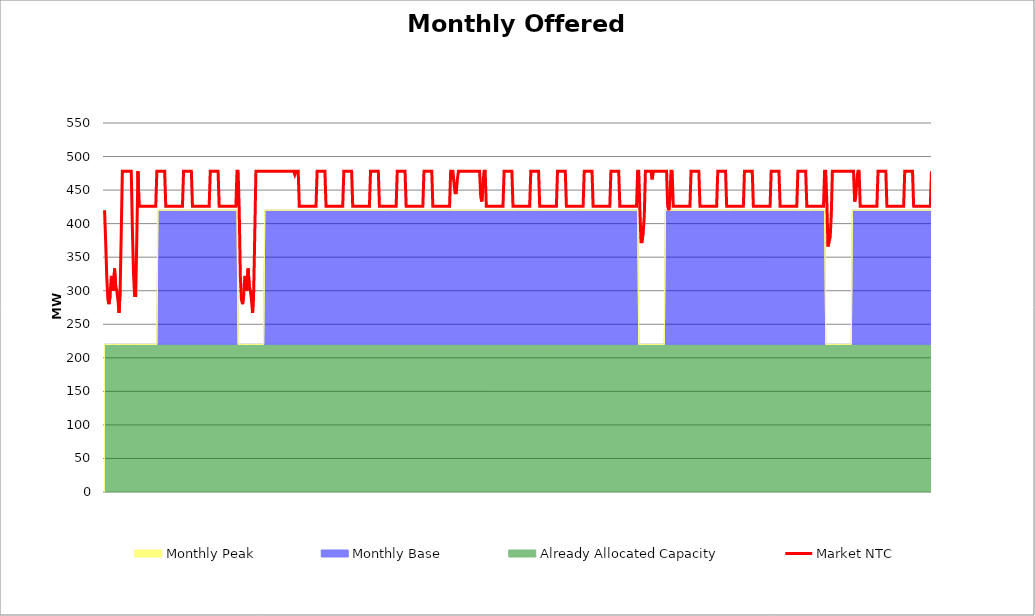
| Category | Market NTC |
|---|---|
| 0 | 420 |
| 1 | 373 |
| 2 | 320 |
| 3 | 287 |
| 4 | 280 |
| 5 | 293 |
| 6 | 320 |
| 7 | 320 |
| 8 | 300 |
| 9 | 333 |
| 10 | 307 |
| 11 | 300 |
| 12 | 287 |
| 13 | 267 |
| 14 | 300 |
| 15 | 386 |
| 16 | 478 |
| 17 | 478 |
| 18 | 478 |
| 19 | 478 |
| 20 | 478 |
| 21 | 478 |
| 22 | 478 |
| 23 | 478 |
| 24 | 478 |
| 25 | 393 |
| 26 | 326 |
| 27 | 293 |
| 28 | 293 |
| 29 | 380 |
| 30 | 478 |
| 31 | 426 |
| 32 | 426 |
| 33 | 426 |
| 34 | 426 |
| 35 | 426 |
| 36 | 426 |
| 37 | 426 |
| 38 | 426 |
| 39 | 426 |
| 40 | 426 |
| 41 | 426 |
| 42 | 426 |
| 43 | 426 |
| 44 | 426 |
| 45 | 426 |
| 46 | 426 |
| 47 | 478 |
| 48 | 478 |
| 49 | 478 |
| 50 | 478 |
| 51 | 478 |
| 52 | 478 |
| 53 | 478 |
| 54 | 478 |
| 55 | 426 |
| 56 | 426 |
| 57 | 426 |
| 58 | 426 |
| 59 | 426 |
| 60 | 426 |
| 61 | 426 |
| 62 | 426 |
| 63 | 426 |
| 64 | 426 |
| 65 | 426 |
| 66 | 426 |
| 67 | 426 |
| 68 | 426 |
| 69 | 426 |
| 70 | 426 |
| 71 | 478 |
| 72 | 478 |
| 73 | 478 |
| 74 | 478 |
| 75 | 478 |
| 76 | 478 |
| 77 | 478 |
| 78 | 478 |
| 79 | 426 |
| 80 | 426 |
| 81 | 426 |
| 82 | 426 |
| 83 | 426 |
| 84 | 426 |
| 85 | 426 |
| 86 | 426 |
| 87 | 426 |
| 88 | 426 |
| 89 | 426 |
| 90 | 426 |
| 91 | 426 |
| 92 | 426 |
| 93 | 426 |
| 94 | 426 |
| 95 | 478 |
| 96 | 478 |
| 97 | 478 |
| 98 | 478 |
| 99 | 478 |
| 100 | 478 |
| 101 | 478 |
| 102 | 478 |
| 103 | 426 |
| 104 | 426 |
| 105 | 426 |
| 106 | 426 |
| 107 | 426 |
| 108 | 426 |
| 109 | 426 |
| 110 | 426 |
| 111 | 426 |
| 112 | 426 |
| 113 | 426 |
| 114 | 426 |
| 115 | 426 |
| 116 | 426 |
| 117 | 426 |
| 118 | 426 |
| 119 | 478 |
| 120 | 478 |
| 121 | 421 |
| 122 | 321 |
| 123 | 287 |
| 124 | 280 |
| 125 | 293 |
| 126 | 320 |
| 127 | 320 |
| 128 | 300 |
| 129 | 333 |
| 130 | 307 |
| 131 | 300 |
| 132 | 287 |
| 133 | 267 |
| 134 | 300 |
| 135 | 386 |
| 136 | 478 |
| 137 | 478 |
| 138 | 478 |
| 139 | 478 |
| 140 | 478 |
| 141 | 478 |
| 142 | 478 |
| 143 | 478 |
| 144 | 478 |
| 145 | 478 |
| 146 | 478 |
| 147 | 478 |
| 148 | 478 |
| 149 | 478 |
| 150 | 478 |
| 151 | 478 |
| 152 | 478 |
| 153 | 478 |
| 154 | 478 |
| 155 | 478 |
| 156 | 478 |
| 157 | 478 |
| 158 | 478 |
| 159 | 478 |
| 160 | 478 |
| 161 | 478 |
| 162 | 478 |
| 163 | 478 |
| 164 | 478 |
| 165 | 478 |
| 166 | 478 |
| 167 | 478 |
| 168 | 478 |
| 169 | 478 |
| 170 | 478 |
| 171 | 473 |
| 172 | 478 |
| 173 | 478 |
| 174 | 478 |
| 175 | 426 |
| 176 | 426 |
| 177 | 426 |
| 178 | 426 |
| 179 | 426 |
| 180 | 426 |
| 181 | 426 |
| 182 | 426 |
| 183 | 426 |
| 184 | 426 |
| 185 | 426 |
| 186 | 426 |
| 187 | 426 |
| 188 | 426 |
| 189 | 426 |
| 190 | 426 |
| 191 | 478 |
| 192 | 478 |
| 193 | 478 |
| 194 | 478 |
| 195 | 478 |
| 196 | 478 |
| 197 | 478 |
| 198 | 478 |
| 199 | 426 |
| 200 | 426 |
| 201 | 426 |
| 202 | 426 |
| 203 | 426 |
| 204 | 426 |
| 205 | 426 |
| 206 | 426 |
| 207 | 426 |
| 208 | 426 |
| 209 | 426 |
| 210 | 426 |
| 211 | 426 |
| 212 | 426 |
| 213 | 426 |
| 214 | 426 |
| 215 | 478 |
| 216 | 478 |
| 217 | 478 |
| 218 | 478 |
| 219 | 478 |
| 220 | 478 |
| 221 | 478 |
| 222 | 478 |
| 223 | 426 |
| 224 | 426 |
| 225 | 426 |
| 226 | 426 |
| 227 | 426 |
| 228 | 426 |
| 229 | 426 |
| 230 | 426 |
| 231 | 426 |
| 232 | 426 |
| 233 | 426 |
| 234 | 426 |
| 235 | 426 |
| 236 | 426 |
| 237 | 426 |
| 238 | 426 |
| 239 | 478 |
| 240 | 478 |
| 241 | 478 |
| 242 | 478 |
| 243 | 478 |
| 244 | 478 |
| 245 | 478 |
| 246 | 478 |
| 247 | 426 |
| 248 | 426 |
| 249 | 426 |
| 250 | 426 |
| 251 | 426 |
| 252 | 426 |
| 253 | 426 |
| 254 | 426 |
| 255 | 426 |
| 256 | 426 |
| 257 | 426 |
| 258 | 426 |
| 259 | 426 |
| 260 | 426 |
| 261 | 426 |
| 262 | 426 |
| 263 | 478 |
| 264 | 478 |
| 265 | 478 |
| 266 | 478 |
| 267 | 478 |
| 268 | 478 |
| 269 | 478 |
| 270 | 478 |
| 271 | 426 |
| 272 | 426 |
| 273 | 426 |
| 274 | 426 |
| 275 | 426 |
| 276 | 426 |
| 277 | 426 |
| 278 | 426 |
| 279 | 426 |
| 280 | 426 |
| 281 | 426 |
| 282 | 426 |
| 283 | 426 |
| 284 | 426 |
| 285 | 426 |
| 286 | 426 |
| 287 | 478 |
| 288 | 478 |
| 289 | 478 |
| 290 | 478 |
| 291 | 478 |
| 292 | 478 |
| 293 | 478 |
| 294 | 478 |
| 295 | 426 |
| 296 | 426 |
| 297 | 426 |
| 298 | 426 |
| 299 | 426 |
| 300 | 426 |
| 301 | 426 |
| 302 | 426 |
| 303 | 426 |
| 304 | 426 |
| 305 | 426 |
| 306 | 426 |
| 307 | 426 |
| 308 | 426 |
| 309 | 426 |
| 310 | 426 |
| 311 | 478 |
| 312 | 478 |
| 313 | 478 |
| 314 | 460 |
| 315 | 446 |
| 316 | 446 |
| 317 | 466 |
| 318 | 478 |
| 319 | 478 |
| 320 | 478 |
| 321 | 478 |
| 322 | 478 |
| 323 | 478 |
| 324 | 478 |
| 325 | 478 |
| 326 | 478 |
| 327 | 478 |
| 328 | 478 |
| 329 | 478 |
| 330 | 478 |
| 331 | 478 |
| 332 | 478 |
| 333 | 478 |
| 334 | 478 |
| 335 | 478 |
| 336 | 478 |
| 337 | 478 |
| 338 | 440 |
| 339 | 433 |
| 340 | 460 |
| 341 | 478 |
| 342 | 478 |
| 343 | 426 |
| 344 | 426 |
| 345 | 426 |
| 346 | 426 |
| 347 | 426 |
| 348 | 426 |
| 349 | 426 |
| 350 | 426 |
| 351 | 426 |
| 352 | 426 |
| 353 | 426 |
| 354 | 426 |
| 355 | 426 |
| 356 | 426 |
| 357 | 426 |
| 358 | 426 |
| 359 | 478 |
| 360 | 478 |
| 361 | 478 |
| 362 | 478 |
| 363 | 478 |
| 364 | 478 |
| 365 | 478 |
| 366 | 478 |
| 367 | 426 |
| 368 | 426 |
| 369 | 426 |
| 370 | 426 |
| 371 | 426 |
| 372 | 426 |
| 373 | 426 |
| 374 | 426 |
| 375 | 426 |
| 376 | 426 |
| 377 | 426 |
| 378 | 426 |
| 379 | 426 |
| 380 | 426 |
| 381 | 426 |
| 382 | 426 |
| 383 | 478 |
| 384 | 478 |
| 385 | 478 |
| 386 | 478 |
| 387 | 478 |
| 388 | 478 |
| 389 | 478 |
| 390 | 478 |
| 391 | 426 |
| 392 | 426 |
| 393 | 426 |
| 394 | 426 |
| 395 | 426 |
| 396 | 426 |
| 397 | 426 |
| 398 | 426 |
| 399 | 426 |
| 400 | 426 |
| 401 | 426 |
| 402 | 426 |
| 403 | 426 |
| 404 | 426 |
| 405 | 426 |
| 406 | 426 |
| 407 | 478 |
| 408 | 478 |
| 409 | 478 |
| 410 | 478 |
| 411 | 478 |
| 412 | 478 |
| 413 | 478 |
| 414 | 478 |
| 415 | 426 |
| 416 | 426 |
| 417 | 426 |
| 418 | 426 |
| 419 | 426 |
| 420 | 426 |
| 421 | 426 |
| 422 | 426 |
| 423 | 426 |
| 424 | 426 |
| 425 | 426 |
| 426 | 426 |
| 427 | 426 |
| 428 | 426 |
| 429 | 426 |
| 430 | 426 |
| 431 | 478 |
| 432 | 478 |
| 433 | 478 |
| 434 | 478 |
| 435 | 478 |
| 436 | 478 |
| 437 | 478 |
| 438 | 478 |
| 439 | 426 |
| 440 | 426 |
| 441 | 426 |
| 442 | 426 |
| 443 | 426 |
| 444 | 426 |
| 445 | 426 |
| 446 | 426 |
| 447 | 426 |
| 448 | 426 |
| 449 | 426 |
| 450 | 426 |
| 451 | 426 |
| 452 | 426 |
| 453 | 426 |
| 454 | 426 |
| 455 | 478 |
| 456 | 478 |
| 457 | 478 |
| 458 | 478 |
| 459 | 478 |
| 460 | 478 |
| 461 | 478 |
| 462 | 478 |
| 463 | 426 |
| 464 | 426 |
| 465 | 426 |
| 466 | 426 |
| 467 | 426 |
| 468 | 426 |
| 469 | 426 |
| 470 | 426 |
| 471 | 426 |
| 472 | 426 |
| 473 | 426 |
| 474 | 426 |
| 475 | 426 |
| 476 | 426 |
| 477 | 426 |
| 478 | 426 |
| 479 | 478 |
| 480 | 478 |
| 481 | 421 |
| 482 | 373 |
| 483 | 373 |
| 484 | 386 |
| 485 | 413 |
| 486 | 478 |
| 487 | 478 |
| 488 | 478 |
| 489 | 478 |
| 490 | 478 |
| 491 | 478 |
| 492 | 466 |
| 493 | 478 |
| 494 | 478 |
| 495 | 478 |
| 496 | 478 |
| 497 | 478 |
| 498 | 478 |
| 499 | 478 |
| 500 | 478 |
| 501 | 478 |
| 502 | 478 |
| 503 | 478 |
| 504 | 478 |
| 505 | 478 |
| 506 | 426 |
| 507 | 420 |
| 508 | 440 |
| 509 | 478 |
| 510 | 478 |
| 511 | 426 |
| 512 | 426 |
| 513 | 426 |
| 514 | 426 |
| 515 | 426 |
| 516 | 426 |
| 517 | 426 |
| 518 | 426 |
| 519 | 426 |
| 520 | 426 |
| 521 | 426 |
| 522 | 426 |
| 523 | 426 |
| 524 | 426 |
| 525 | 426 |
| 526 | 426 |
| 527 | 478 |
| 528 | 478 |
| 529 | 478 |
| 530 | 478 |
| 531 | 478 |
| 532 | 478 |
| 533 | 478 |
| 534 | 478 |
| 535 | 426 |
| 536 | 426 |
| 537 | 426 |
| 538 | 426 |
| 539 | 426 |
| 540 | 426 |
| 541 | 426 |
| 542 | 426 |
| 543 | 426 |
| 544 | 426 |
| 545 | 426 |
| 546 | 426 |
| 547 | 426 |
| 548 | 426 |
| 549 | 426 |
| 550 | 426 |
| 551 | 478 |
| 552 | 478 |
| 553 | 478 |
| 554 | 478 |
| 555 | 478 |
| 556 | 478 |
| 557 | 478 |
| 558 | 478 |
| 559 | 426 |
| 560 | 426 |
| 561 | 426 |
| 562 | 426 |
| 563 | 426 |
| 564 | 426 |
| 565 | 426 |
| 566 | 426 |
| 567 | 426 |
| 568 | 426 |
| 569 | 426 |
| 570 | 426 |
| 571 | 426 |
| 572 | 426 |
| 573 | 426 |
| 574 | 426 |
| 575 | 478 |
| 576 | 478 |
| 577 | 478 |
| 578 | 478 |
| 579 | 478 |
| 580 | 478 |
| 581 | 478 |
| 582 | 478 |
| 583 | 426 |
| 584 | 426 |
| 585 | 426 |
| 586 | 426 |
| 587 | 426 |
| 588 | 426 |
| 589 | 426 |
| 590 | 426 |
| 591 | 426 |
| 592 | 426 |
| 593 | 426 |
| 594 | 426 |
| 595 | 426 |
| 596 | 426 |
| 597 | 426 |
| 598 | 426 |
| 599 | 478 |
| 600 | 478 |
| 601 | 478 |
| 602 | 478 |
| 603 | 478 |
| 604 | 478 |
| 605 | 478 |
| 606 | 478 |
| 607 | 426 |
| 608 | 426 |
| 609 | 426 |
| 610 | 426 |
| 611 | 426 |
| 612 | 426 |
| 613 | 426 |
| 614 | 426 |
| 615 | 426 |
| 616 | 426 |
| 617 | 426 |
| 618 | 426 |
| 619 | 426 |
| 620 | 426 |
| 621 | 426 |
| 622 | 426 |
| 623 | 478 |
| 624 | 478 |
| 625 | 478 |
| 626 | 478 |
| 627 | 478 |
| 628 | 478 |
| 629 | 478 |
| 630 | 478 |
| 631 | 426 |
| 632 | 426 |
| 633 | 426 |
| 634 | 426 |
| 635 | 426 |
| 636 | 426 |
| 637 | 426 |
| 638 | 426 |
| 639 | 426 |
| 640 | 426 |
| 641 | 426 |
| 642 | 426 |
| 643 | 426 |
| 644 | 426 |
| 645 | 426 |
| 646 | 426 |
| 647 | 478 |
| 648 | 478 |
| 649 | 433 |
| 650 | 366 |
| 651 | 373 |
| 652 | 380 |
| 653 | 413 |
| 654 | 478 |
| 655 | 478 |
| 656 | 478 |
| 657 | 478 |
| 658 | 478 |
| 659 | 478 |
| 660 | 478 |
| 661 | 478 |
| 662 | 478 |
| 663 | 478 |
| 664 | 478 |
| 665 | 478 |
| 666 | 478 |
| 667 | 478 |
| 668 | 478 |
| 669 | 478 |
| 670 | 478 |
| 671 | 478 |
| 672 | 478 |
| 673 | 478 |
| 674 | 433 |
| 675 | 440 |
| 676 | 466 |
| 677 | 478 |
| 678 | 478 |
| 679 | 426 |
| 680 | 426 |
| 681 | 426 |
| 682 | 426 |
| 683 | 426 |
| 684 | 426 |
| 685 | 426 |
| 686 | 426 |
| 687 | 426 |
| 688 | 426 |
| 689 | 426 |
| 690 | 426 |
| 691 | 426 |
| 692 | 426 |
| 693 | 426 |
| 694 | 426 |
| 695 | 478 |
| 696 | 478 |
| 697 | 478 |
| 698 | 478 |
| 699 | 478 |
| 700 | 478 |
| 701 | 478 |
| 702 | 478 |
| 703 | 426 |
| 704 | 426 |
| 705 | 426 |
| 706 | 426 |
| 707 | 426 |
| 708 | 426 |
| 709 | 426 |
| 710 | 426 |
| 711 | 426 |
| 712 | 426 |
| 713 | 426 |
| 714 | 426 |
| 715 | 426 |
| 716 | 426 |
| 717 | 426 |
| 718 | 426 |
| 719 | 478 |
| 720 | 478 |
| 721 | 478 |
| 722 | 478 |
| 723 | 478 |
| 724 | 478 |
| 725 | 478 |
| 726 | 478 |
| 727 | 426 |
| 728 | 426 |
| 729 | 426 |
| 730 | 426 |
| 731 | 426 |
| 732 | 426 |
| 733 | 426 |
| 734 | 426 |
| 735 | 426 |
| 736 | 426 |
| 737 | 426 |
| 738 | 426 |
| 739 | 426 |
| 740 | 426 |
| 741 | 426 |
| 742 | 426 |
| 743 | 478 |